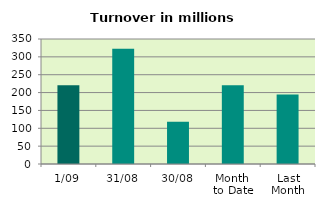
| Category | Series 0 |
|---|---|
| 1/09 | 220.314 |
| 31/08 | 322.723 |
| 30/08 | 118.583 |
| Month 
to Date | 220.314 |
| Last
Month | 194.848 |